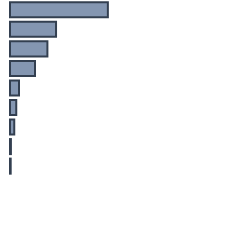
| Category | Series 0 |
|---|---|
| 0 | 43.116 |
| 1 | 20.28 |
| 2 | 16.475 |
| 3 | 10.963 |
| 4 | 3.916 |
| 5 | 2.701 |
| 6 | 1.838 |
| 7 | 0.405 |
| 8 | 0.307 |
| 9 | 0 |
| 10 | 0 |